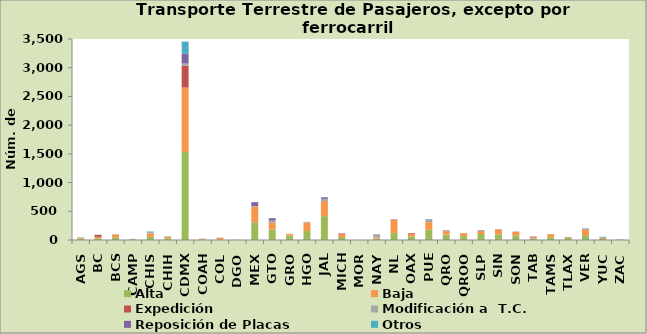
| Category | Alta                                         | Baja | Expedición | Modificación a  T.C. | Reposición de Placas | Otros |
|---|---|---|---|---|---|---|
| AGS | 22 | 12 | 0 | 11 | 0 | 0 |
| BC | 29 | 25 | 35 | 0 | 0 | 3 |
| BCS | 48 | 47 | 0 | 6 | 0 | 0 |
| CAMP | 9 | 6 | 4 | 0 | 0 | 0 |
| CHIS | 54 | 61 | 3 | 7 | 6 | 17 |
| CHIH | 31 | 20 | 1 | 11 | 0 | 0 |
| CDMX | 1534 | 1120 | 379 | 40 | 170 | 211 |
| COAH | 10 | 11 | 2 | 0 | 0 | 0 |
| COL | 8 | 30 | 2 | 0 | 0 | 0 |
| DGO | 2 | 4 | 0 | 0 | 0 | 0 |
| MEX | 309 | 269 | 1 | 10 | 70 | 0 |
| GTO | 184 | 113 | 2 | 38 | 43 | 0 |
| GRO | 76 | 28 | 0 | 3 | 0 | 0 |
| HGO | 157 | 144 | 2 | 14 | 0 | 0 |
| JAL | 416 | 257 | 5 | 39 | 27 | 4 |
| MICH | 51 | 56 | 2 | 5 | 6 | 0 |
| MOR | 0 | 1 | 0 | 0 | 0 | 0 |
| NAY | 27 | 16 | 3 | 52 | 2 | 0 |
| NL | 121 | 233 | 0 | 1 | 7 | 0 |
| OAX | 63 | 44 | 12 | 1 | 2 | 0 |
| PUE | 179 | 132 | 0 | 41 | 7 | 5 |
| QRO | 96 | 57 | 2 | 2 | 10 | 0 |
| QROO | 67 | 50 | 2 | 3 | 1 | 0 |
| SLP | 105 | 46 | 8 | 11 | 4 | 0 |
| SIN | 100 | 75 | 5 | 0 | 5 | 0 |
| SON | 81 | 62 | 1 | 6 | 0 | 0 |
| TAB | 25 | 20 | 15 | 0 | 0 | 0 |
| TAMS | 47 | 54 | 0 | 2 | 0 | 0 |
| TLAX | 38 | 12 | 2 | 0 | 1 | 0 |
| VER | 85 | 100 | 0 | 0 | 12 | 4 |
| YUC | 18 | 20 | 0 | 2 | 1 | 14 |
| ZAC | 3 | 9 | 0 | 0 | 0 | 0 |